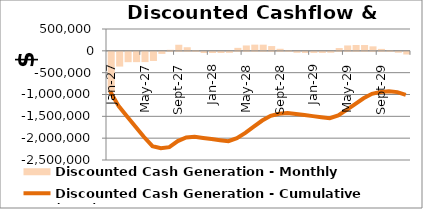
| Category | Discounted Cash Generation - Monthly |
|---|---|
| 2027-01-01 | -928681.192 |
| 2027-02-01 | -337465.845 |
| 2027-03-01 | -237026.054 |
| 2027-04-01 | -235846.82 |
| 2027-05-01 | -234673.453 |
| 2027-06-01 | -209182.39 |
| 2027-07-01 | -47049.701 |
| 2027-08-01 | 23696.797 |
| 2027-09-01 | 139238.615 |
| 2027-10-01 | 82091.43 |
| 2027-11-01 | 16859.771 |
| 2027-12-01 | -26439.201 |
| 2028-01-01 | -26307.662 |
| 2028-02-01 | -26176.778 |
| 2028-03-01 | -22511.657 |
| 2028-04-01 | 67939.462 |
| 2028-05-01 | 123085.081 |
| 2028-06-01 | 141567.087 |
| 2028-07-01 | 140871.168 |
| 2028-08-01 | 109184.284 |
| 2028-09-01 | 46969.026 |
| 2028-10-01 | 16056.407 |
| 2028-11-01 | -21631.118 |
| 2028-12-01 | -24903.224 |
| 2029-01-01 | -24779.328 |
| 2029-02-01 | -24656.047 |
| 2029-03-01 | -21203.85 |
| 2029-04-01 | 63992.542 |
| 2029-05-01 | 123351.677 |
| 2029-06-01 | 133424.079 |
| 2029-07-01 | 132765.754 |
| 2029-08-01 | 102916.953 |
| 2029-09-01 | 44313.39 |
| 2029-10-01 | 15194.026 |
| 2029-11-01 | -20374.466 |
| 2029-12-01 | -61154.394 |